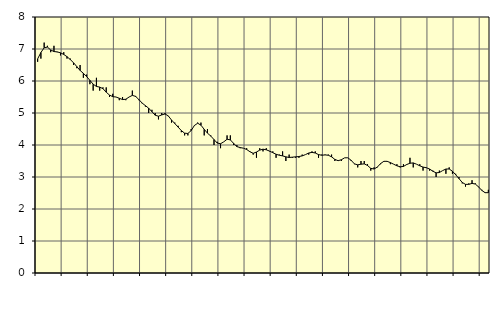
| Category | Piggar | Jordbruk, skogsbruk o fiske, SNI 01-031 |
|---|---|---|
| nan | 6.6 | 6.69 |
| 87.0 | 6.7 | 6.89 |
| 87.0 | 7.2 | 7.04 |
| 87.0 | 7.1 | 7.06 |
| nan | 6.9 | 6.97 |
| 88.0 | 7.1 | 6.92 |
| 88.0 | 6.9 | 6.91 |
| 88.0 | 6.8 | 6.88 |
| nan | 6.9 | 6.83 |
| 89.0 | 6.7 | 6.76 |
| 89.0 | 6.7 | 6.67 |
| 89.0 | 6.5 | 6.57 |
| nan | 6.4 | 6.45 |
| 90.0 | 6.5 | 6.33 |
| 90.0 | 6.1 | 6.24 |
| 90.0 | 6.2 | 6.14 |
| nan | 5.9 | 6.02 |
| 91.0 | 5.7 | 5.9 |
| 91.0 | 6.1 | 5.83 |
| 91.0 | 5.7 | 5.81 |
| nan | 5.8 | 5.76 |
| 92.0 | 5.8 | 5.65 |
| 92.0 | 5.5 | 5.56 |
| 92.0 | 5.6 | 5.51 |
| nan | 5.5 | 5.5 |
| 93.0 | 5.4 | 5.46 |
| 93.0 | 5.5 | 5.42 |
| 93.0 | 5.4 | 5.43 |
| nan | 5.5 | 5.5 |
| 94.0 | 5.7 | 5.55 |
| 94.0 | 5.5 | 5.52 |
| 94.0 | 5.4 | 5.42 |
| nan | 5.3 | 5.31 |
| 95.0 | 5.2 | 5.23 |
| 95.0 | 5 | 5.15 |
| 95.0 | 5.1 | 5.04 |
| nan | 5 | 4.93 |
| 96.0 | 4.8 | 4.9 |
| 96.0 | 5 | 4.94 |
| 96.0 | 5 | 4.97 |
| nan | 4.9 | 4.91 |
| 97.0 | 4.7 | 4.78 |
| 97.0 | 4.7 | 4.67 |
| 97.0 | 4.6 | 4.56 |
| nan | 4.4 | 4.45 |
| 98.0 | 4.3 | 4.37 |
| 98.0 | 4.3 | 4.36 |
| 98.0 | 4.5 | 4.45 |
| nan | 4.6 | 4.61 |
| 99.0 | 4.7 | 4.68 |
| 99.0 | 4.7 | 4.62 |
| 99.0 | 4.3 | 4.49 |
| nan | 4.5 | 4.37 |
| 0.0 | 4.3 | 4.28 |
| 0.0 | 4 | 4.17 |
| 0.0 | 4.1 | 4.06 |
| nan | 3.9 | 4.04 |
| 1.0 | 4.1 | 4.1 |
| 1.0 | 4.3 | 4.18 |
| 1.0 | 4.3 | 4.16 |
| nan | 4 | 4.05 |
| 2.0 | 4 | 3.95 |
| 2.0 | 3.9 | 3.92 |
| 2.0 | 3.9 | 3.9 |
| nan | 3.9 | 3.86 |
| 3.0 | 3.8 | 3.79 |
| 3.0 | 3.7 | 3.74 |
| 3.0 | 3.6 | 3.78 |
| nan | 3.9 | 3.84 |
| 4.0 | 3.8 | 3.87 |
| 4.0 | 3.9 | 3.85 |
| 4.0 | 3.8 | 3.81 |
| nan | 3.8 | 3.76 |
| 5.0 | 3.6 | 3.71 |
| 5.0 | 3.7 | 3.68 |
| 5.0 | 3.8 | 3.66 |
| nan | 3.5 | 3.63 |
| 6.0 | 3.7 | 3.61 |
| 6.0 | 3.6 | 3.62 |
| 6.0 | 3.6 | 3.63 |
| nan | 3.6 | 3.64 |
| 7.0 | 3.7 | 3.66 |
| 7.0 | 3.7 | 3.7 |
| 7.0 | 3.7 | 3.75 |
| nan | 3.8 | 3.77 |
| 8.0 | 3.8 | 3.75 |
| 8.0 | 3.6 | 3.7 |
| 8.0 | 3.7 | 3.68 |
| nan | 3.7 | 3.69 |
| 9.0 | 3.7 | 3.68 |
| 9.0 | 3.7 | 3.63 |
| 9.0 | 3.5 | 3.55 |
| nan | 3.5 | 3.51 |
| 10.0 | 3.5 | 3.54 |
| 10.0 | 3.6 | 3.6 |
| 10.0 | 3.6 | 3.6 |
| nan | 3.5 | 3.52 |
| 11.0 | 3.4 | 3.41 |
| 11.0 | 3.3 | 3.38 |
| 11.0 | 3.5 | 3.4 |
| nan | 3.5 | 3.41 |
| 12.0 | 3.4 | 3.36 |
| 12.0 | 3.2 | 3.27 |
| 12.0 | 3.3 | 3.25 |
| nan | 3.3 | 3.31 |
| 13.0 | 3.4 | 3.42 |
| 13.0 | 3.5 | 3.49 |
| 13.0 | 3.5 | 3.49 |
| nan | 3.4 | 3.45 |
| 14.0 | 3.4 | 3.4 |
| 14.0 | 3.4 | 3.35 |
| 14.0 | 3.3 | 3.32 |
| nan | 3.4 | 3.33 |
| 15.0 | 3.4 | 3.39 |
| 15.0 | 3.6 | 3.43 |
| 15.0 | 3.3 | 3.44 |
| nan | 3.4 | 3.4 |
| 16.0 | 3.4 | 3.35 |
| 16.0 | 3.2 | 3.31 |
| 16.0 | 3.3 | 3.29 |
| nan | 3.2 | 3.25 |
| 17.0 | 3.2 | 3.18 |
| 17.0 | 3 | 3.13 |
| 17.0 | 3.2 | 3.14 |
| nan | 3.2 | 3.2 |
| 18.0 | 3.1 | 3.25 |
| 18.0 | 3.3 | 3.25 |
| 18.0 | 3.1 | 3.18 |
| nan | 3.1 | 3.07 |
| 19.0 | 3 | 2.95 |
| 19.0 | 2.8 | 2.83 |
| 19.0 | 2.7 | 2.77 |
| nan | 2.8 | 2.77 |
| 20.0 | 2.9 | 2.8 |
| 20.0 | 2.8 | 2.78 |
| 20.0 | 2.7 | 2.69 |
| nan | 2.6 | 2.58 |
| 21.0 | 2.5 | 2.51 |
| 21.0 | 2.6 | 2.51 |